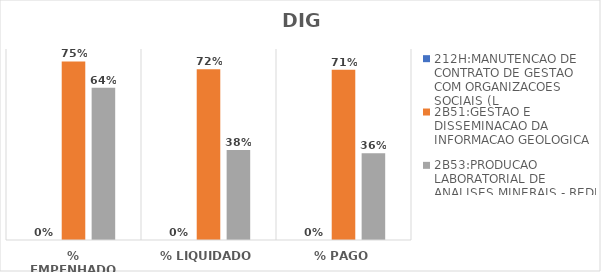
| Category | 212H:MANUTENCAO DE CONTRATO DE GESTAO COM ORGANIZACOES SOCIAIS (L | 2B51:GESTAO E DISSEMINACAO DA INFORMACAO GEOLOGICA | 2B53:PRODUCAO LABORATORIAL DE ANALISES MINERAIS - REDE LAMIN |
|---|---|---|---|
| % EMPENHADO | 0 | 0.748 | 0.637 |
| % LIQUIDADO | 0 | 0.715 | 0.377 |
| % PAGO | 0 | 0.713 | 0.364 |